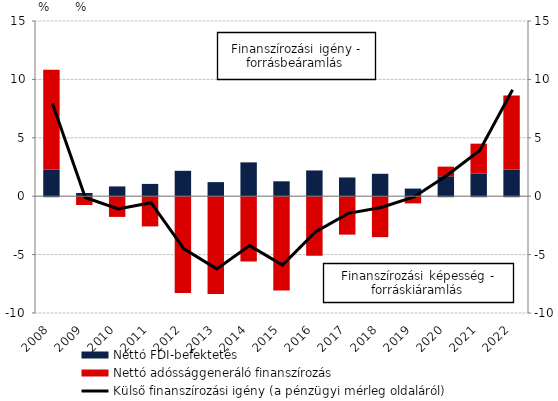
| Category | Nettó FDI-befektetés | Nettó adóssággeneráló finanszírozás |
|---|---|---|
| 2008.0 | 2.256 | 8.562 |
| 2009.0 | 0.274 | -0.756 |
| 2010.0 | 0.837 | -1.772 |
| 2011.0 | 1.053 | -2.588 |
| 2012.0 | 2.175 | -8.282 |
| 2013.0 | 1.206 | -8.378 |
| 2014.0 | 2.897 | -5.584 |
| 2015.0 | 1.275 | -8.078 |
| 2016.0 | 2.205 | -5.09 |
| 2017.0 | 1.604 | -3.291 |
| 2018.0 | 1.919 | -3.507 |
| 2019.0 | 0.652 | -0.616 |
| 2020.0 | 1.705 | 0.827 |
| 2021.0 | 1.924 | 2.574 |
| 2022.0 | 2.283 | 6.338 |